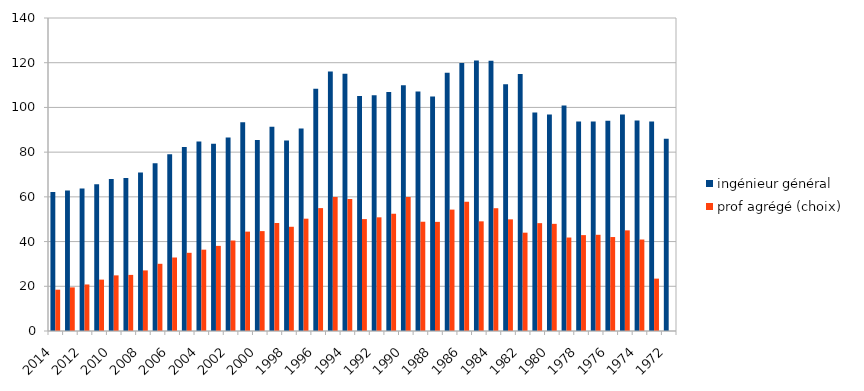
| Category | ingénieur général | prof agrégé (choix) |
|---|---|---|
|  | 62.119 | 18.478 |
|  | 62.818 | 19.51 |
|  | 63.713 | 20.812 |
|  | 65.638 | 22.978 |
|  | 68.008 | 24.885 |
|  | 68.429 | 25.092 |
|  | 70.867 | 27.104 |
|  | 75.057 | 30.058 |
|  | 79.082 | 32.874 |
|  | 82.3 | 34.975 |
|  | 84.786 | 36.381 |
|  | 83.754 | 38.073 |
|  | 86.54 | 40.47 |
|  | 93.321 | 44.451 |
|  | 85.432 | 44.681 |
|  | 91.41 | 48.305 |
|  | 85.242 | 46.616 |
|  | 90.586 | 50.236 |
|  | 108.377 | 54.969 |
|  | 116.104 | 59.967 |
|  | 115.062 | 59.002 |
|  | 105.151 | 50.056 |
|  | 105.493 | 50.847 |
|  | 106.896 | 52.446 |
|  | 109.943 | 59.989 |
|  | 107.082 | 48.872 |
|  | 104.839 | 48.815 |
|  | 115.516 | 54.297 |
|  | 119.855 | 57.765 |
|  | 120.983 | 49.05 |
|  | 120.93 | 54.923 |
|  | 110.339 | 49.937 |
|  | 114.974 | 43.979 |
|  | 97.724 | 48.241 |
|  | 96.793 | 47.929 |
|  | 100.884 | 41.812 |
|  | 93.744 | 42.887 |
|  | 93.728 | 43.032 |
|  | 94.038 | 42.026 |
|  | 96.841 | 45.015 |
|  | 94.138 | 40.915 |
|  | 93.67 | 23.427 |
|  | 86.01 | 0 |